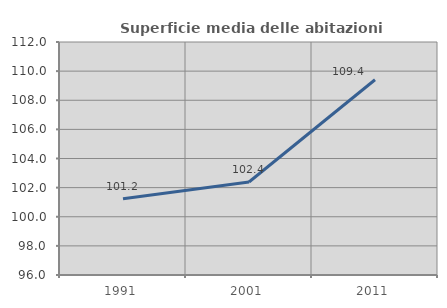
| Category | Superficie media delle abitazioni occupate |
|---|---|
| 1991.0 | 101.244 |
| 2001.0 | 102.385 |
| 2011.0 | 109.407 |